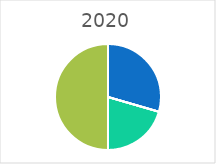
| Category | 2020 |
|---|---|
| Ouvriers | 23 |
| Employés | 0 |
| Maitrise | 0 |
| Ingénieurs et Cadres | 16 |
| Autres | 0 |
| Total | 39 |